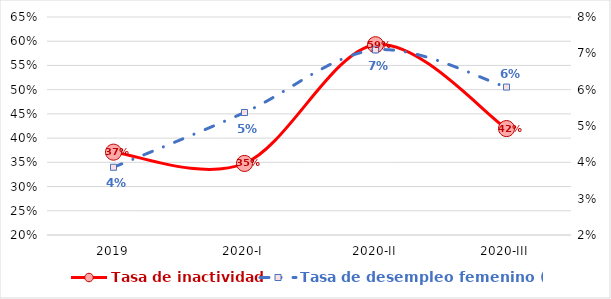
| Category | Tasa de inactividad |
|---|---|
| 2019 | 0.371 |
| 2020-I | 0.348 |
| 2020-II | 0.593 |
| 2020-III | 0.42 |